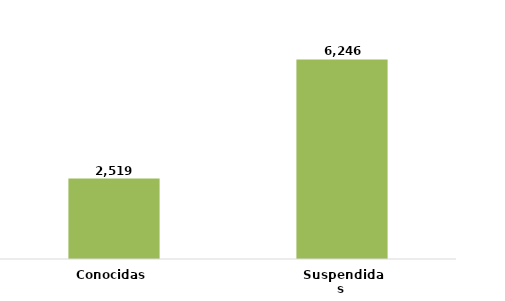
| Category | Series 0 |
|---|---|
| Conocidas  | 0.287 |
| Suspendidas  | 0.713 |